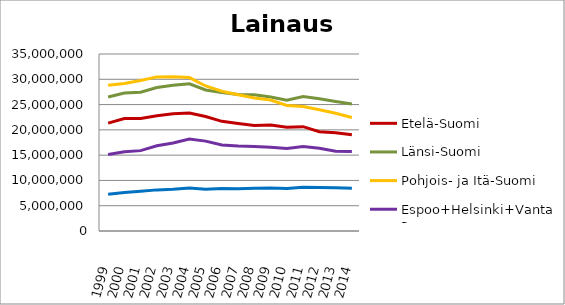
| Category | Etelä-Suomi | Länsi-Suomi | Pohjois- ja Itä-Suomi | Espoo+Helsinki+Vantaa | Muu Uusimaa |
|---|---|---|---|---|---|
| 1999.0 | 21330651 | 26499621 | 28818500 | 15125153 | 7279601 |
| 2000.0 | 22252262 | 27267624 | 29153371 | 15676730 | 7621488 |
| 2001.0 | 22229200 | 27457746 | 29776000 | 15890651 | 7849187 |
| 2002.0 | 22794984 | 28357637 | 30473942 | 16850073 | 8131550 |
| 2003.0 | 23164944 | 28825819 | 30523221 | 17398606 | 8238744 |
| 2004.0 | 23334827 | 29095793 | 30339457 | 18172484 | 8498739 |
| 2005.0 | 22638652 | 27882571 | 28678414 | 17769833 | 8245917 |
| 2006.0 | 21685123 | 27386764 | 27646972 | 17016319 | 8413525 |
| 2007.0 | 21271360 | 27015156 | 26936296 | 16797543 | 8365844 |
| 2008.0 | 20860039 | 26950641 | 26302803 | 16696623 | 8449685 |
| 2009.0 | 20938398 | 26489138 | 25887545 | 16576342 | 8525908 |
| 2010.0 | 20533586 | 25869940 | 24821851 | 16330372 | 8412380 |
| 2011.0 | 20631852 | 26580118 | 24617735 | 16714971 | 8655971 |
| 2012.0 | 19638421 | 26134397 | 23991214 | 16367047 | 8591857 |
| 2013.0 | 19419295 | 25609060 | 23282968 | 15767000 | 8547792 |
| 2014.0 | 19029588 | 25092971 | 22435916 | 15731444 | 8441130 |